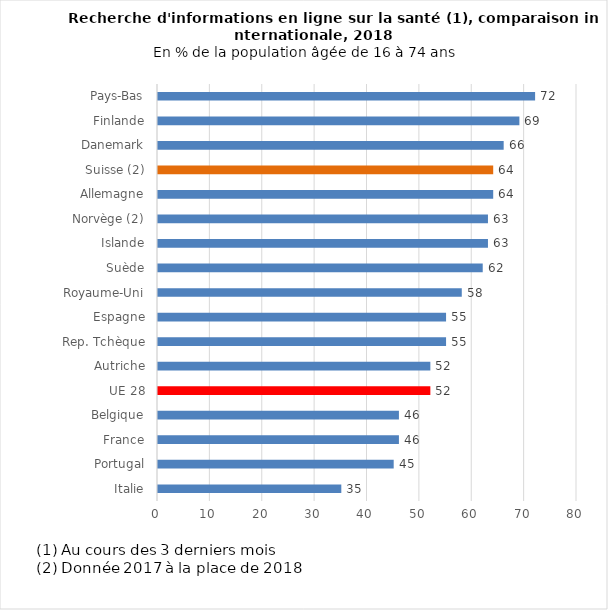
| Category | 2018 |
|---|---|
| Italie | 35 |
| Portugal | 45 |
| France | 46 |
| Belgique | 46 |
| UE 28 | 52 |
| Autriche | 52 |
| Rep. Tchèque | 55 |
| Espagne | 55 |
| Royaume-Uni | 58 |
| Suède | 62 |
| Islande | 63 |
| Norvège (2) | 63 |
| Allemagne | 64 |
| Suisse (2) | 64 |
| Danemark | 66 |
| Finlande | 69 |
| Pays-Bas | 72 |